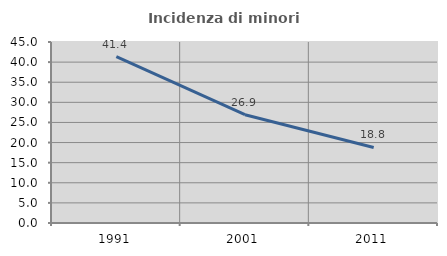
| Category | Incidenza di minori stranieri |
|---|---|
| 1991.0 | 41.379 |
| 2001.0 | 26.923 |
| 2011.0 | 18.788 |